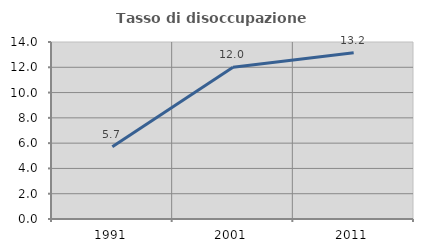
| Category | Tasso di disoccupazione giovanile  |
|---|---|
| 1991.0 | 5.714 |
| 2001.0 | 12 |
| 2011.0 | 13.158 |